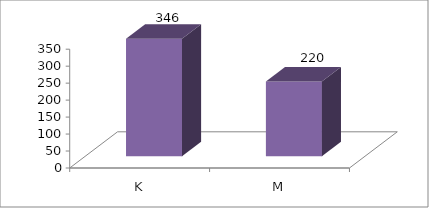
| Category | Series 0 |
|---|---|
| K | 346 |
| M | 220 |